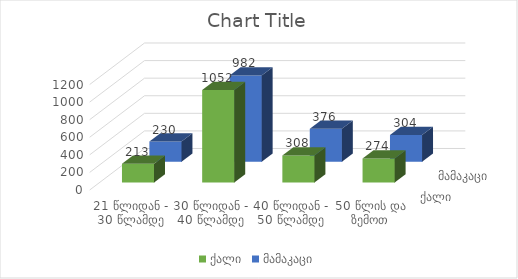
| Category | ქალი | მამაკაცი |
|---|---|---|
| 21 წლიდან - 30 წლამდე | 213 | 230 |
| 30 წლიდან - 40 წლამდე | 1052 | 982 |
| 40 წლიდან - 50 წლამდე | 308 | 376 |
| 50 წლის და ზემოთ | 274 | 304 |